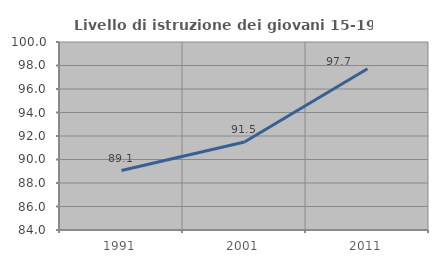
| Category | Livello di istruzione dei giovani 15-19 anni |
|---|---|
| 1991.0 | 89.062 |
| 2001.0 | 91.489 |
| 2011.0 | 97.727 |